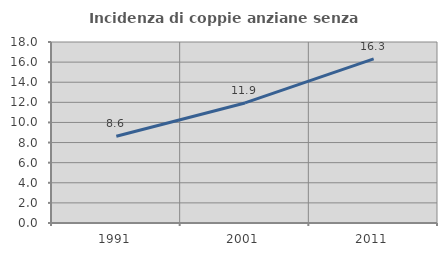
| Category | Incidenza di coppie anziane senza figli  |
|---|---|
| 1991.0 | 8.62 |
| 2001.0 | 11.939 |
| 2011.0 | 16.318 |